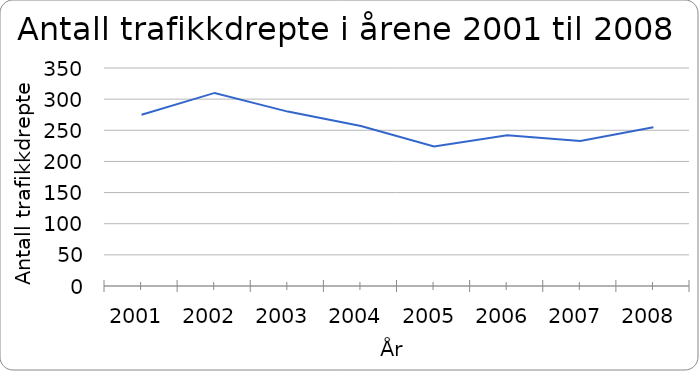
| Category | Antall trafikkdrepte |
|---|---|
| 2001.0 | 275 |
| 2002.0 | 310 |
| 2003.0 | 280 |
| 2004.0 | 257 |
| 2005.0 | 224 |
| 2006.0 | 242 |
| 2007.0 | 233 |
| 2008.0 | 255 |